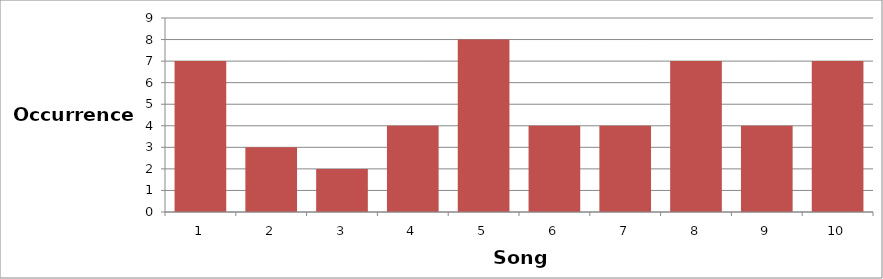
| Category | occurrences |
|---|---|
| 0 | 7 |
| 1 | 3 |
| 2 | 2 |
| 3 | 4 |
| 4 | 8 |
| 5 | 4 |
| 6 | 4 |
| 7 | 7 |
| 8 | 4 |
| 9 | 7 |